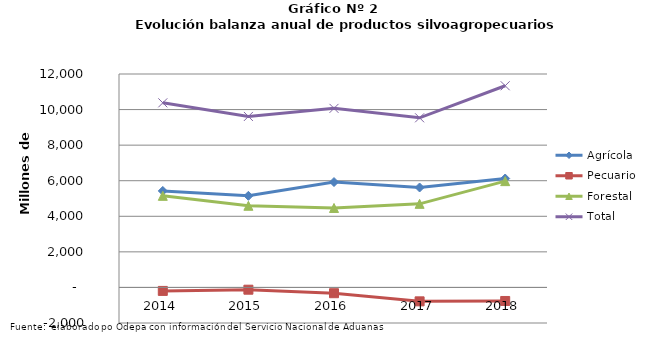
| Category | Agrícola | Pecuario | Forestal | Total |
|---|---|---|---|---|
| 2014.0 | 5424524 | -195643 | 5149868 | 10378749 |
| 2015.0 | 5149872 | -127785 | 4591408 | 9613495 |
| 2016.0 | 5924661 | -325421 | 4468104 | 10067344 |
| 2017.0 | 5619304 | -782654 | 4700192 | 9536842 |
| 2018.0 | 6124452 | -761884 | 5976134 | 11338702 |